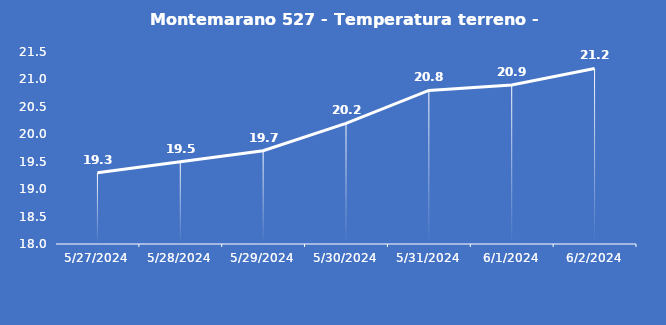
| Category | Montemarano 527 - Temperatura terreno - Grezzo (°C) |
|---|---|
| 5/27/24 | 19.3 |
| 5/28/24 | 19.5 |
| 5/29/24 | 19.7 |
| 5/30/24 | 20.2 |
| 5/31/24 | 20.8 |
| 6/1/24 | 20.9 |
| 6/2/24 | 21.2 |